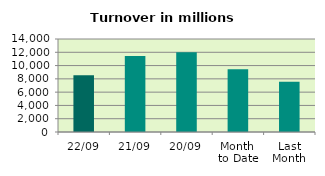
| Category | Series 0 |
|---|---|
| 22/09 | 8535.446 |
| 21/09 | 11446.878 |
| 20/09 | 11996.293 |
| Month 
to Date | 9451.594 |
| Last
Month | 7565.704 |